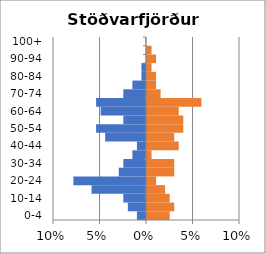
| Category | % Men | % Women |
|---|---|---|
| 0-4 | -0.01 | 0.024 |
| 5-9 | -0.02 | 0.029 |
| 10-14 | -0.024 | 0.024 |
| 15-19 | -0.059 | 0.02 |
| 20-24 | -0.078 | 0.01 |
| 25-29 | -0.029 | 0.029 |
| 30-34 | -0.024 | 0.029 |
| 35-39 | -0.015 | 0.005 |
| 40-44 | -0.01 | 0.034 |
| 45-49 | -0.044 | 0.029 |
| 50-54 | -0.054 | 0.039 |
| 55-59 | -0.024 | 0.039 |
| 60-64 | -0.049 | 0.034 |
| 65-69 | -0.054 | 0.059 |
| 70-74 | -0.024 | 0.015 |
| 75-79 | -0.015 | 0.01 |
| 80-84 | -0.005 | 0.01 |
| 85-89 | -0.005 | 0.005 |
| 90-94 | 0 | 0.01 |
| 95-99 | 0 | 0.005 |
| 100+ | 0 | 0 |